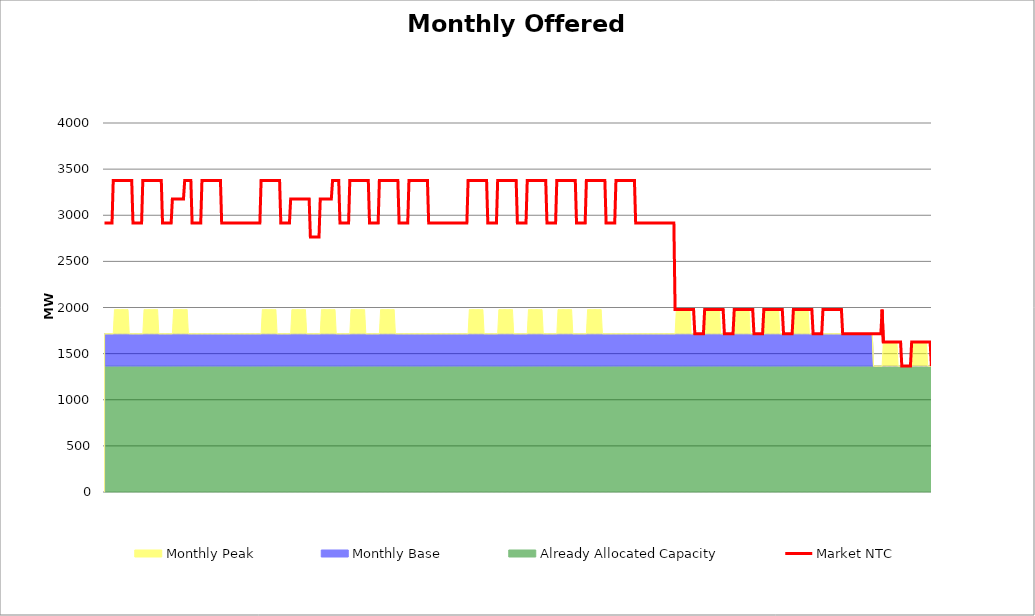
| Category | Market NTC |
|---|---|
| 0 | 2915 |
| 1 | 2915 |
| 2 | 2915 |
| 3 | 2915 |
| 4 | 2915 |
| 5 | 2915 |
| 6 | 2915 |
| 7 | 3377 |
| 8 | 3377 |
| 9 | 3377 |
| 10 | 3377 |
| 11 | 3377 |
| 12 | 3377 |
| 13 | 3377 |
| 14 | 3377 |
| 15 | 3377 |
| 16 | 3377 |
| 17 | 3377 |
| 18 | 3377 |
| 19 | 3377 |
| 20 | 3377 |
| 21 | 3377 |
| 22 | 3377 |
| 23 | 2915 |
| 24 | 2915 |
| 25 | 2915 |
| 26 | 2915 |
| 27 | 2915 |
| 28 | 2915 |
| 29 | 2915 |
| 30 | 2915 |
| 31 | 3377 |
| 32 | 3377 |
| 33 | 3377 |
| 34 | 3377 |
| 35 | 3377 |
| 36 | 3377 |
| 37 | 3377 |
| 38 | 3377 |
| 39 | 3377 |
| 40 | 3377 |
| 41 | 3377 |
| 42 | 3377 |
| 43 | 3377 |
| 44 | 3377 |
| 45 | 3377 |
| 46 | 3377 |
| 47 | 2915 |
| 48 | 2915 |
| 49 | 2915 |
| 50 | 2915 |
| 51 | 2915 |
| 52 | 2915 |
| 53 | 2915 |
| 54 | 2915 |
| 55 | 3177 |
| 56 | 3177 |
| 57 | 3177 |
| 58 | 3177 |
| 59 | 3177 |
| 60 | 3177 |
| 61 | 3177 |
| 62 | 3177 |
| 63 | 3177 |
| 64 | 3177 |
| 65 | 3377 |
| 66 | 3377 |
| 67 | 3377 |
| 68 | 3377 |
| 69 | 3377 |
| 70 | 3377 |
| 71 | 2915 |
| 72 | 2915 |
| 73 | 2915 |
| 74 | 2915 |
| 75 | 2915 |
| 76 | 2915 |
| 77 | 2915 |
| 78 | 2915 |
| 79 | 3377 |
| 80 | 3377 |
| 81 | 3377 |
| 82 | 3377 |
| 83 | 3377 |
| 84 | 3377 |
| 85 | 3377 |
| 86 | 3377 |
| 87 | 3377 |
| 88 | 3377 |
| 89 | 3377 |
| 90 | 3377 |
| 91 | 3377 |
| 92 | 3377 |
| 93 | 3377 |
| 94 | 3377 |
| 95 | 2915 |
| 96 | 2915 |
| 97 | 2915 |
| 98 | 2915 |
| 99 | 2915 |
| 100 | 2915 |
| 101 | 2915 |
| 102 | 2915 |
| 103 | 2915 |
| 104 | 2915 |
| 105 | 2915 |
| 106 | 2915 |
| 107 | 2915 |
| 108 | 2915 |
| 109 | 2915 |
| 110 | 2915 |
| 111 | 2915 |
| 112 | 2915 |
| 113 | 2915 |
| 114 | 2915 |
| 115 | 2915 |
| 116 | 2915 |
| 117 | 2915 |
| 118 | 2915 |
| 119 | 2915 |
| 120 | 2915 |
| 121 | 2915 |
| 122 | 2915 |
| 123 | 2915 |
| 124 | 2915 |
| 125 | 2915 |
| 126 | 2915 |
| 127 | 3377 |
| 128 | 3377 |
| 129 | 3377 |
| 130 | 3377 |
| 131 | 3377 |
| 132 | 3377 |
| 133 | 3377 |
| 134 | 3377 |
| 135 | 3377 |
| 136 | 3377 |
| 137 | 3377 |
| 138 | 3377 |
| 139 | 3377 |
| 140 | 3377 |
| 141 | 3377 |
| 142 | 3377 |
| 143 | 2915 |
| 144 | 2915 |
| 145 | 2915 |
| 146 | 2915 |
| 147 | 2915 |
| 148 | 2915 |
| 149 | 2915 |
| 150 | 2915 |
| 151 | 3177 |
| 152 | 3177 |
| 153 | 3177 |
| 154 | 3177 |
| 155 | 3177 |
| 156 | 3177 |
| 157 | 3177 |
| 158 | 3177 |
| 159 | 3177 |
| 160 | 3177 |
| 161 | 3177 |
| 162 | 3177 |
| 163 | 3177 |
| 164 | 3177 |
| 165 | 3177 |
| 166 | 3177 |
| 167 | 2765 |
| 168 | 2765 |
| 169 | 2765 |
| 170 | 2765 |
| 171 | 2765 |
| 172 | 2765 |
| 173 | 2765 |
| 174 | 2765 |
| 175 | 3177 |
| 176 | 3177 |
| 177 | 3177 |
| 178 | 3177 |
| 179 | 3177 |
| 180 | 3177 |
| 181 | 3177 |
| 182 | 3177 |
| 183 | 3177 |
| 184 | 3177 |
| 185 | 3377 |
| 186 | 3377 |
| 187 | 3377 |
| 188 | 3377 |
| 189 | 3377 |
| 190 | 3377 |
| 191 | 2915 |
| 192 | 2915 |
| 193 | 2915 |
| 194 | 2915 |
| 195 | 2915 |
| 196 | 2915 |
| 197 | 2915 |
| 198 | 2915 |
| 199 | 3377 |
| 200 | 3377 |
| 201 | 3377 |
| 202 | 3377 |
| 203 | 3377 |
| 204 | 3377 |
| 205 | 3377 |
| 206 | 3377 |
| 207 | 3377 |
| 208 | 3377 |
| 209 | 3377 |
| 210 | 3377 |
| 211 | 3377 |
| 212 | 3377 |
| 213 | 3377 |
| 214 | 3377 |
| 215 | 2915 |
| 216 | 2915 |
| 217 | 2915 |
| 218 | 2915 |
| 219 | 2915 |
| 220 | 2915 |
| 221 | 2915 |
| 222 | 2915 |
| 223 | 3377 |
| 224 | 3377 |
| 225 | 3377 |
| 226 | 3377 |
| 227 | 3377 |
| 228 | 3377 |
| 229 | 3377 |
| 230 | 3377 |
| 231 | 3377 |
| 232 | 3377 |
| 233 | 3377 |
| 234 | 3377 |
| 235 | 3377 |
| 236 | 3377 |
| 237 | 3377 |
| 238 | 3377 |
| 239 | 2915 |
| 240 | 2915 |
| 241 | 2915 |
| 242 | 2915 |
| 243 | 2915 |
| 244 | 2915 |
| 245 | 2915 |
| 246 | 2915 |
| 247 | 3377 |
| 248 | 3377 |
| 249 | 3377 |
| 250 | 3377 |
| 251 | 3377 |
| 252 | 3377 |
| 253 | 3377 |
| 254 | 3377 |
| 255 | 3377 |
| 256 | 3377 |
| 257 | 3377 |
| 258 | 3377 |
| 259 | 3377 |
| 260 | 3377 |
| 261 | 3377 |
| 262 | 3377 |
| 263 | 2915 |
| 264 | 2915 |
| 265 | 2915 |
| 266 | 2915 |
| 267 | 2915 |
| 268 | 2915 |
| 269 | 2915 |
| 270 | 2915 |
| 271 | 2915 |
| 272 | 2915 |
| 273 | 2915 |
| 274 | 2915 |
| 275 | 2915 |
| 276 | 2915 |
| 277 | 2915 |
| 278 | 2915 |
| 279 | 2915 |
| 280 | 2915 |
| 281 | 2915 |
| 282 | 2915 |
| 283 | 2915 |
| 284 | 2915 |
| 285 | 2915 |
| 286 | 2915 |
| 287 | 2915 |
| 288 | 2915 |
| 289 | 2915 |
| 290 | 2915 |
| 291 | 2915 |
| 292 | 2915 |
| 293 | 2915 |
| 294 | 2915 |
| 295 | 3377 |
| 296 | 3377 |
| 297 | 3377 |
| 298 | 3377 |
| 299 | 3377 |
| 300 | 3377 |
| 301 | 3377 |
| 302 | 3377 |
| 303 | 3377 |
| 304 | 3377 |
| 305 | 3377 |
| 306 | 3377 |
| 307 | 3377 |
| 308 | 3377 |
| 309 | 3377 |
| 310 | 3377 |
| 311 | 2915 |
| 312 | 2915 |
| 313 | 2915 |
| 314 | 2915 |
| 315 | 2915 |
| 316 | 2915 |
| 317 | 2915 |
| 318 | 2915 |
| 319 | 3377 |
| 320 | 3377 |
| 321 | 3377 |
| 322 | 3377 |
| 323 | 3377 |
| 324 | 3377 |
| 325 | 3377 |
| 326 | 3377 |
| 327 | 3377 |
| 328 | 3377 |
| 329 | 3377 |
| 330 | 3377 |
| 331 | 3377 |
| 332 | 3377 |
| 333 | 3377 |
| 334 | 3377 |
| 335 | 2915 |
| 336 | 2915 |
| 337 | 2915 |
| 338 | 2915 |
| 339 | 2915 |
| 340 | 2915 |
| 341 | 2915 |
| 342 | 2915 |
| 343 | 3377 |
| 344 | 3377 |
| 345 | 3377 |
| 346 | 3377 |
| 347 | 3377 |
| 348 | 3377 |
| 349 | 3377 |
| 350 | 3377 |
| 351 | 3377 |
| 352 | 3377 |
| 353 | 3377 |
| 354 | 3377 |
| 355 | 3377 |
| 356 | 3377 |
| 357 | 3377 |
| 358 | 3377 |
| 359 | 2915 |
| 360 | 2915 |
| 361 | 2915 |
| 362 | 2915 |
| 363 | 2915 |
| 364 | 2915 |
| 365 | 2915 |
| 366 | 2915 |
| 367 | 3377 |
| 368 | 3377 |
| 369 | 3377 |
| 370 | 3377 |
| 371 | 3377 |
| 372 | 3377 |
| 373 | 3377 |
| 374 | 3377 |
| 375 | 3377 |
| 376 | 3377 |
| 377 | 3377 |
| 378 | 3377 |
| 379 | 3377 |
| 380 | 3377 |
| 381 | 3377 |
| 382 | 3377 |
| 383 | 2915 |
| 384 | 2915 |
| 385 | 2915 |
| 386 | 2915 |
| 387 | 2915 |
| 388 | 2915 |
| 389 | 2915 |
| 390 | 2915 |
| 391 | 3377 |
| 392 | 3377 |
| 393 | 3377 |
| 394 | 3377 |
| 395 | 3377 |
| 396 | 3377 |
| 397 | 3377 |
| 398 | 3377 |
| 399 | 3377 |
| 400 | 3377 |
| 401 | 3377 |
| 402 | 3377 |
| 403 | 3377 |
| 404 | 3377 |
| 405 | 3377 |
| 406 | 3377 |
| 407 | 2915 |
| 408 | 2915 |
| 409 | 2915 |
| 410 | 2915 |
| 411 | 2915 |
| 412 | 2915 |
| 413 | 2915 |
| 414 | 2915 |
| 415 | 3377 |
| 416 | 3377 |
| 417 | 3377 |
| 418 | 3377 |
| 419 | 3377 |
| 420 | 3377 |
| 421 | 3377 |
| 422 | 3377 |
| 423 | 3377 |
| 424 | 3377 |
| 425 | 3377 |
| 426 | 3377 |
| 427 | 3377 |
| 428 | 3377 |
| 429 | 3377 |
| 430 | 3377 |
| 431 | 2915 |
| 432 | 2915 |
| 433 | 2915 |
| 434 | 2915 |
| 435 | 2915 |
| 436 | 2915 |
| 437 | 2915 |
| 438 | 2915 |
| 439 | 2915 |
| 440 | 2915 |
| 441 | 2915 |
| 442 | 2915 |
| 443 | 2915 |
| 444 | 2915 |
| 445 | 2915 |
| 446 | 2915 |
| 447 | 2915 |
| 448 | 2915 |
| 449 | 2915 |
| 450 | 2915 |
| 451 | 2915 |
| 452 | 2915 |
| 453 | 2915 |
| 454 | 2915 |
| 455 | 2915 |
| 456 | 2915 |
| 457 | 2915 |
| 458 | 2915 |
| 459 | 2915 |
| 460 | 2915 |
| 461 | 2915 |
| 462 | 2915 |
| 463 | 1977 |
| 464 | 1977 |
| 465 | 1977 |
| 466 | 1977 |
| 467 | 1977 |
| 468 | 1977 |
| 469 | 1977 |
| 470 | 1977 |
| 471 | 1977 |
| 472 | 1977 |
| 473 | 1977 |
| 474 | 1977 |
| 475 | 1977 |
| 476 | 1977 |
| 477 | 1977 |
| 478 | 1977 |
| 479 | 1715 |
| 480 | 1715 |
| 481 | 1715 |
| 482 | 1715 |
| 483 | 1715 |
| 484 | 1715 |
| 485 | 1715 |
| 486 | 1715 |
| 487 | 1977 |
| 488 | 1977 |
| 489 | 1977 |
| 490 | 1977 |
| 491 | 1977 |
| 492 | 1977 |
| 493 | 1977 |
| 494 | 1977 |
| 495 | 1977 |
| 496 | 1977 |
| 497 | 1977 |
| 498 | 1977 |
| 499 | 1977 |
| 500 | 1977 |
| 501 | 1977 |
| 502 | 1977 |
| 503 | 1715 |
| 504 | 1715 |
| 505 | 1715 |
| 506 | 1715 |
| 507 | 1715 |
| 508 | 1715 |
| 509 | 1715 |
| 510 | 1715 |
| 511 | 1977 |
| 512 | 1977 |
| 513 | 1977 |
| 514 | 1977 |
| 515 | 1977 |
| 516 | 1977 |
| 517 | 1977 |
| 518 | 1977 |
| 519 | 1977 |
| 520 | 1977 |
| 521 | 1977 |
| 522 | 1977 |
| 523 | 1977 |
| 524 | 1977 |
| 525 | 1977 |
| 526 | 1977 |
| 527 | 1715 |
| 528 | 1715 |
| 529 | 1715 |
| 530 | 1715 |
| 531 | 1715 |
| 532 | 1715 |
| 533 | 1715 |
| 534 | 1715 |
| 535 | 1977 |
| 536 | 1977 |
| 537 | 1977 |
| 538 | 1977 |
| 539 | 1977 |
| 540 | 1977 |
| 541 | 1977 |
| 542 | 1977 |
| 543 | 1977 |
| 544 | 1977 |
| 545 | 1977 |
| 546 | 1977 |
| 547 | 1977 |
| 548 | 1977 |
| 549 | 1977 |
| 550 | 1977 |
| 551 | 1715 |
| 552 | 1715 |
| 553 | 1715 |
| 554 | 1715 |
| 555 | 1715 |
| 556 | 1715 |
| 557 | 1715 |
| 558 | 1715 |
| 559 | 1977 |
| 560 | 1977 |
| 561 | 1977 |
| 562 | 1977 |
| 563 | 1977 |
| 564 | 1977 |
| 565 | 1977 |
| 566 | 1977 |
| 567 | 1977 |
| 568 | 1977 |
| 569 | 1977 |
| 570 | 1977 |
| 571 | 1977 |
| 572 | 1977 |
| 573 | 1977 |
| 574 | 1977 |
| 575 | 1715 |
| 576 | 1715 |
| 577 | 1715 |
| 578 | 1715 |
| 579 | 1715 |
| 580 | 1715 |
| 581 | 1715 |
| 582 | 1715 |
| 583 | 1977 |
| 584 | 1977 |
| 585 | 1977 |
| 586 | 1977 |
| 587 | 1977 |
| 588 | 1977 |
| 589 | 1977 |
| 590 | 1977 |
| 591 | 1977 |
| 592 | 1977 |
| 593 | 1977 |
| 594 | 1977 |
| 595 | 1977 |
| 596 | 1977 |
| 597 | 1977 |
| 598 | 1977 |
| 599 | 1715 |
| 600 | 1715 |
| 601 | 1715 |
| 602 | 1715 |
| 603 | 1715 |
| 604 | 1715 |
| 605 | 1715 |
| 606 | 1715 |
| 607 | 1715 |
| 608 | 1715 |
| 609 | 1715 |
| 610 | 1715 |
| 611 | 1715 |
| 612 | 1715 |
| 613 | 1715 |
| 614 | 1715 |
| 615 | 1715 |
| 616 | 1715 |
| 617 | 1715 |
| 618 | 1715 |
| 619 | 1715 |
| 620 | 1715 |
| 621 | 1715 |
| 622 | 1715 |
| 623 | 1715 |
| 624 | 1715 |
| 625 | 1715 |
| 626 | 1715 |
| 627 | 1715 |
| 628 | 1715 |
| 629 | 1715 |
| 630 | 1715 |
| 631 | 1977 |
| 632 | 1627 |
| 633 | 1627 |
| 634 | 1627 |
| 635 | 1627 |
| 636 | 1627 |
| 637 | 1627 |
| 638 | 1627 |
| 639 | 1627 |
| 640 | 1627 |
| 641 | 1627 |
| 642 | 1627 |
| 643 | 1627 |
| 644 | 1627 |
| 645 | 1627 |
| 646 | 1627 |
| 647 | 1365 |
| 648 | 1365 |
| 649 | 1365 |
| 650 | 1365 |
| 651 | 1365 |
| 652 | 1365 |
| 653 | 1365 |
| 654 | 1365 |
| 655 | 1627 |
| 656 | 1627 |
| 657 | 1627 |
| 658 | 1627 |
| 659 | 1627 |
| 660 | 1627 |
| 661 | 1627 |
| 662 | 1627 |
| 663 | 1627 |
| 664 | 1627 |
| 665 | 1627 |
| 666 | 1627 |
| 667 | 1627 |
| 668 | 1627 |
| 669 | 1627 |
| 670 | 1627 |
| 671 | 1365 |